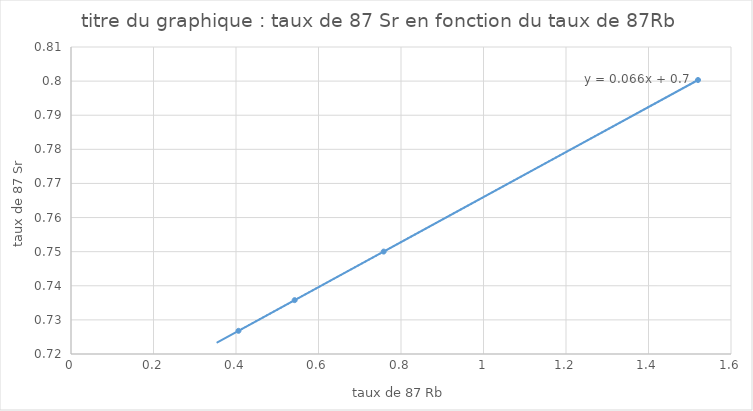
| Category | 87Sr * |
|---|---|
| 0.758 | 0.75 |
| 1.52 | 0.8 |
| 0.406 | 0.727 |
| 0.5422 | 0.736 |